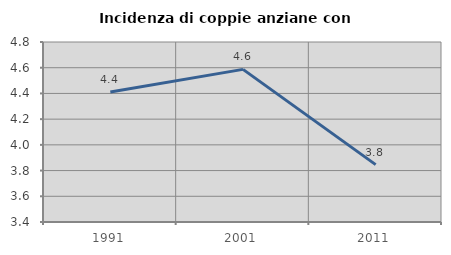
| Category | Incidenza di coppie anziane con figli |
|---|---|
| 1991.0 | 4.412 |
| 2001.0 | 4.587 |
| 2011.0 | 3.846 |